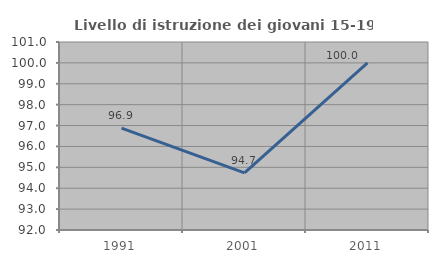
| Category | Livello di istruzione dei giovani 15-19 anni |
|---|---|
| 1991.0 | 96.875 |
| 2001.0 | 94.737 |
| 2011.0 | 100 |